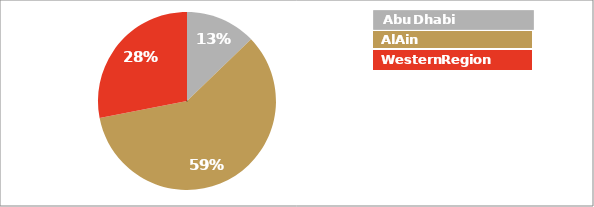
| Category | Series 0 |
|---|---|
| 0 | 94380 |
| 1 | 436656 |
| 2 | 206921 |